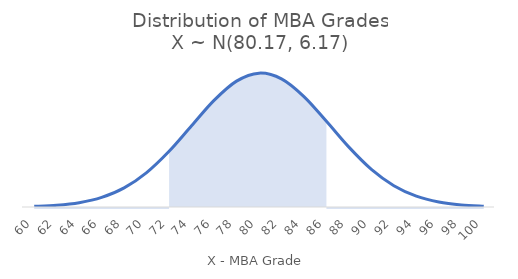
| Category | Probability Density |
|---|---|
| 60.0 | 0 |
| 62.0 | 0.001 |
| 64.0 | 0.002 |
| 66.0 | 0.005 |
| 68.0 | 0.009 |
| 70.0 | 0.017 |
| 72.0 | 0.027 |
| 74.0 | 0.039 |
| 76.0 | 0.051 |
| 78.0 | 0.061 |
| 80.0 | 0.065 |
| 82.0 | 0.062 |
| 84.0 | 0.053 |
| 86.0 | 0.041 |
| 88.0 | 0.029 |
| 90.0 | 0.018 |
| 92.0 | 0.01 |
| 94.0 | 0.005 |
| 96.0 | 0.002 |
| 98.0 | 0.001 |
| 100.0 | 0 |